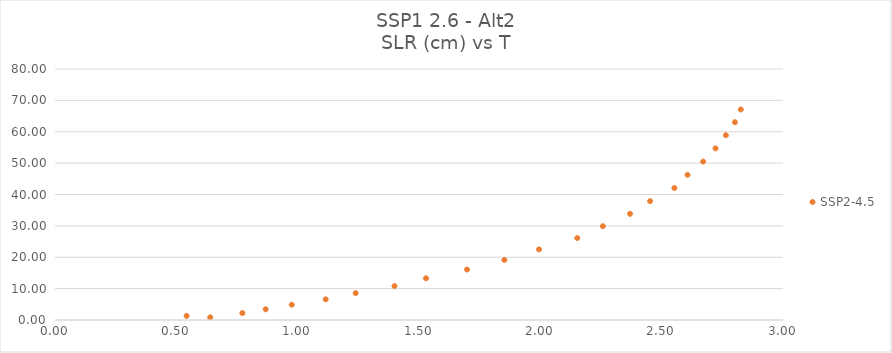
| Category | SSP2-4.5 |
|---|---|
| 0.639593181 | 0.851 |
| 0.542364652 | 1.315 |
| 0.772130534 | 2.215 |
| 0.868150926 | 3.412 |
| 0.975561417 | 4.865 |
| 1.115501613 | 6.592 |
| 1.238923475 | 8.555 |
| 1.399070338 | 10.811 |
| 1.529039554 | 13.299 |
| 1.697646221 | 16.096 |
| 1.851643574 | 19.172 |
| 1.994657691 | 22.503 |
| 2.152091025 | 26.119 |
| 2.257656515 | 29.899 |
| 2.369691711 | 33.85 |
| 2.452372005 | 37.895 |
| 2.552606809 | 42.072 |
| 2.606602005 | 46.261 |
| 2.670787201 | 50.482 |
| 2.722005926 | 54.7 |
| 2.76454524 | 58.889 |
| 2.802006907 | 63.036 |
| 2.825892005 | 67.105 |